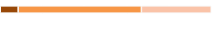
| Category | Series 0 | Series 1 | Series 2 |
|---|---|---|---|
| 0 | 0.085 | 0.584 | 0.331 |